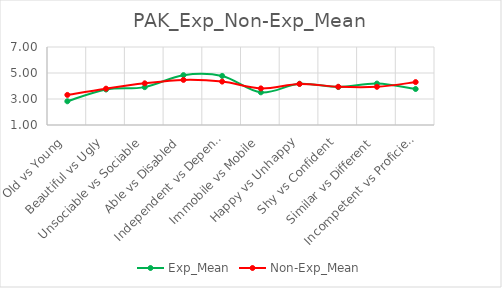
| Category | Exp_Mean | Non-Exp_Mean |
|---|---|---|
| Old vs Young | 2.825 | 3.314 |
|  Beautiful vs Ugly | 3.731 | 3.795 |
| Unsociable vs Sociable | 3.912 | 4.205 |
| Able vs Disabled | 4.834 | 4.469 |
| Independent vs Dependent | 4.776 | 4.339 |
| Immobile vs Mobile | 3.513 | 3.816 |
| Happy vs Unhappy | 4.172 | 4.159 |
| Shy vs Confident | 3.919 | 3.941 |
| Similar vs Different | 4.185 | 3.937 |
| Incompetent vs Proficient | 3.769 | 4.301 |